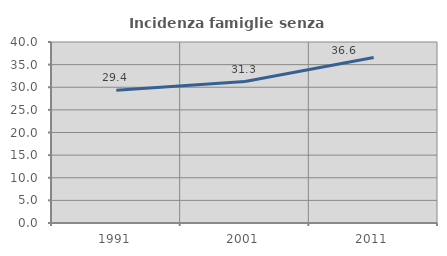
| Category | Incidenza famiglie senza nuclei |
|---|---|
| 1991.0 | 29.36 |
| 2001.0 | 31.25 |
| 2011.0 | 36.566 |